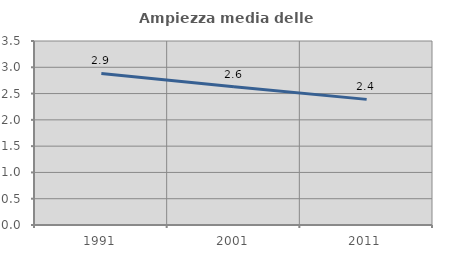
| Category | Ampiezza media delle famiglie |
|---|---|
| 1991.0 | 2.883 |
| 2001.0 | 2.631 |
| 2011.0 | 2.39 |